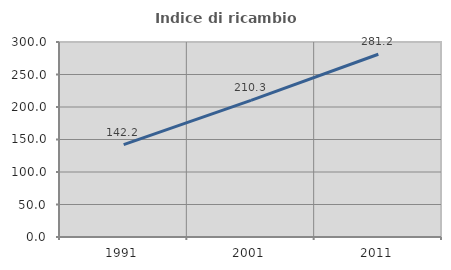
| Category | Indice di ricambio occupazionale  |
|---|---|
| 1991.0 | 142.158 |
| 2001.0 | 210.258 |
| 2011.0 | 281.178 |